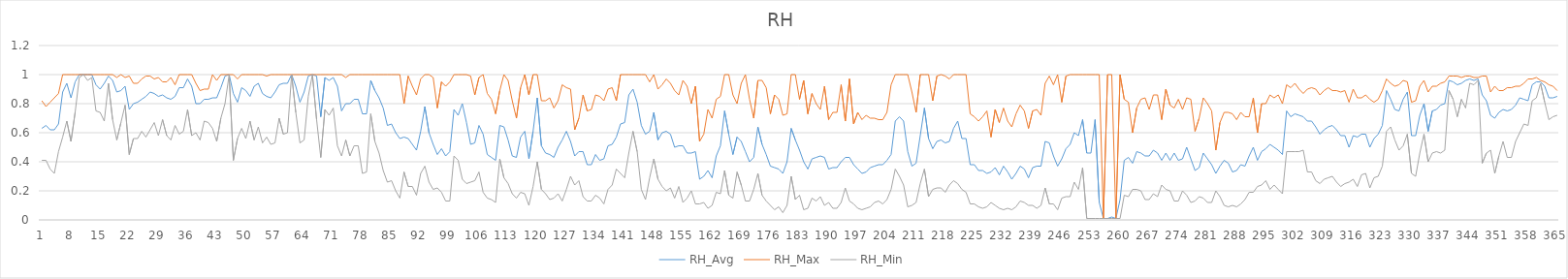
| Category | RH_Avg | RH_Max | RH_Min |
|---|---|---|---|
| 0 | 0.63 | 0.82 | 0.41 |
| 1 | 0.65 | 0.78 | 0.41 |
| 2 | 0.62 | 0.81 | 0.35 |
| 3 | 0.62 | 0.84 | 0.32 |
| 4 | 0.66 | 0.87 | 0.47 |
| 5 | 0.88 | 1 | 0.57 |
| 6 | 0.94 | 1 | 0.68 |
| 7 | 0.84 | 1 | 0.54 |
| 8 | 0.95 | 1 | 0.74 |
| 9 | 1 | 1 | 0.98 |
| 10 | 1 | 1 | 1 |
| 11 | 1 | 1 | 0.96 |
| 12 | 1 | 1 | 0.98 |
| 13 | 0.93 | 1 | 0.75 |
| 14 | 0.9 | 1 | 0.74 |
| 15 | 0.94 | 1 | 0.68 |
| 16 | 0.99 | 1 | 0.94 |
| 17 | 0.96 | 1 | 0.69 |
| 18 | 0.88 | 0.98 | 0.55 |
| 19 | 0.89 | 1 | 0.67 |
| 20 | 0.92 | 0.98 | 0.79 |
| 21 | 0.76 | 0.99 | 0.45 |
| 22 | 0.8 | 0.94 | 0.56 |
| 23 | 0.81 | 0.94 | 0.56 |
| 24 | 0.83 | 0.97 | 0.61 |
| 25 | 0.85 | 0.99 | 0.57 |
| 26 | 0.88 | 0.99 | 0.62 |
| 27 | 0.87 | 0.97 | 0.67 |
| 28 | 0.85 | 0.98 | 0.58 |
| 29 | 0.86 | 0.95 | 0.69 |
| 30 | 0.84 | 0.95 | 0.58 |
| 31 | 0.83 | 0.98 | 0.55 |
| 32 | 0.85 | 0.93 | 0.65 |
| 33 | 0.91 | 1 | 0.59 |
| 34 | 0.91 | 1 | 0.61 |
| 35 | 0.97 | 1 | 0.76 |
| 36 | 0.92 | 1 | 0.58 |
| 37 | 0.8 | 0.94 | 0.6 |
| 38 | 0.8 | 0.89 | 0.55 |
| 39 | 0.83 | 0.9 | 0.68 |
| 40 | 0.83 | 0.9 | 0.67 |
| 41 | 0.84 | 1 | 0.63 |
| 42 | 0.84 | 0.96 | 0.54 |
| 43 | 0.91 | 1 | 0.7 |
| 44 | 0.99 | 1 | 0.8 |
| 45 | 1 | 1 | 1 |
| 46 | 0.87 | 1 | 0.41 |
| 47 | 0.81 | 0.97 | 0.56 |
| 48 | 0.91 | 1 | 0.63 |
| 49 | 0.89 | 1 | 0.56 |
| 50 | 0.85 | 1 | 0.68 |
| 51 | 0.92 | 1 | 0.55 |
| 52 | 0.94 | 1 | 0.64 |
| 53 | 0.87 | 1 | 0.53 |
| 54 | 0.85 | 0.99 | 0.57 |
| 55 | 0.84 | 1 | 0.52 |
| 56 | 0.88 | 1 | 0.53 |
| 57 | 0.93 | 1 | 0.7 |
| 58 | 0.94 | 1 | 0.59 |
| 59 | 0.94 | 1 | 0.6 |
| 60 | 1 | 1 | 1 |
| 61 | 0.92 | 1 | 0.74 |
| 62 | 0.81 | 1 | 0.53 |
| 63 | 0.88 | 1 | 0.55 |
| 64 | 0.99 | 1 | 0.85 |
| 65 | 1 | 1 | 1 |
| 66 | 0.99 | 1 | 0.69 |
| 67 | 0.71 | 1 | 0.43 |
| 68 | 0.98 | 1 | 0.76 |
| 69 | 0.96 | 1 | 0.72 |
| 70 | 0.98 | 1 | 0.77 |
| 71 | 0.92 | 1 | 0.51 |
| 72 | 0.75 | 1 | 0.44 |
| 73 | 0.8 | 0.98 | 0.55 |
| 74 | 0.8 | 1 | 0.44 |
| 75 | 0.83 | 1 | 0.51 |
| 76 | 0.83 | 1 | 0.51 |
| 77 | 0.73 | 1 | 0.32 |
| 78 | 0.73 | 1 | 0.33 |
| 79 | 0.96 | 1 | 0.73 |
| 80 | 0.89 | 1 | 0.54 |
| 81 | 0.84 | 1 | 0.46 |
| 82 | 0.77 | 1 | 0.34 |
| 83 | 0.65 | 1 | 0.26 |
| 84 | 0.66 | 1 | 0.27 |
| 85 | 0.6 | 1 | 0.2 |
| 86 | 0.56 | 1 | 0.15 |
| 87 | 0.57 | 0.8 | 0.33 |
| 88 | 0.56 | 0.99 | 0.23 |
| 89 | 0.52 | 0.92 | 0.23 |
| 90 | 0.48 | 0.86 | 0.17 |
| 91 | 0.61 | 0.97 | 0.32 |
| 92 | 0.78 | 1 | 0.37 |
| 93 | 0.6 | 1 | 0.26 |
| 94 | 0.52 | 0.98 | 0.21 |
| 95 | 0.45 | 0.77 | 0.22 |
| 96 | 0.49 | 0.95 | 0.19 |
| 97 | 0.44 | 0.92 | 0.13 |
| 98 | 0.47 | 0.95 | 0.13 |
| 99 | 0.76 | 1 | 0.44 |
| 100 | 0.72 | 1 | 0.41 |
| 101 | 0.8 | 1 | 0.28 |
| 102 | 0.67 | 1 | 0.25 |
| 103 | 0.52 | 0.99 | 0.26 |
| 104 | 0.53 | 0.86 | 0.27 |
| 105 | 0.65 | 0.98 | 0.33 |
| 106 | 0.59 | 1 | 0.19 |
| 107 | 0.45 | 0.87 | 0.15 |
| 108 | 0.43 | 0.83 | 0.14 |
| 109 | 0.41 | 0.73 | 0.12 |
| 110 | 0.65 | 0.89 | 0.42 |
| 111 | 0.64 | 1 | 0.29 |
| 112 | 0.55 | 0.96 | 0.25 |
| 113 | 0.44 | 0.82 | 0.18 |
| 114 | 0.43 | 0.7 | 0.15 |
| 115 | 0.57 | 0.91 | 0.19 |
| 116 | 0.61 | 1 | 0.18 |
| 117 | 0.42 | 0.86 | 0.1 |
| 118 | 0.61 | 1 | 0.23 |
| 119 | 0.84 | 1 | 0.4 |
| 120 | 0.51 | 0.82 | 0.21 |
| 121 | 0.46 | 0.82 | 0.18 |
| 122 | 0.45 | 0.84 | 0.14 |
| 123 | 0.43 | 0.77 | 0.15 |
| 124 | 0.5 | 0.82 | 0.18 |
| 125 | 0.55 | 0.93 | 0.13 |
| 126 | 0.61 | 0.91 | 0.21 |
| 127 | 0.54 | 0.9 | 0.3 |
| 128 | 0.44 | 0.62 | 0.24 |
| 129 | 0.47 | 0.7 | 0.27 |
| 130 | 0.47 | 0.86 | 0.16 |
| 131 | 0.38 | 0.75 | 0.13 |
| 132 | 0.38 | 0.76 | 0.13 |
| 133 | 0.45 | 0.86 | 0.17 |
| 134 | 0.41 | 0.85 | 0.15 |
| 135 | 0.42 | 0.82 | 0.11 |
| 136 | 0.51 | 0.9 | 0.21 |
| 137 | 0.52 | 0.91 | 0.24 |
| 138 | 0.57 | 0.82 | 0.35 |
| 139 | 0.66 | 1 | 0.32 |
| 140 | 0.67 | 1 | 0.29 |
| 141 | 0.86 | 1 | 0.46 |
| 142 | 0.9 | 1 | 0.61 |
| 143 | 0.81 | 1 | 0.47 |
| 144 | 0.65 | 1 | 0.21 |
| 145 | 0.59 | 1 | 0.14 |
| 146 | 0.61 | 0.95 | 0.29 |
| 147 | 0.74 | 1 | 0.42 |
| 148 | 0.55 | 0.9 | 0.28 |
| 149 | 0.6 | 0.93 | 0.23 |
| 150 | 0.61 | 0.97 | 0.2 |
| 151 | 0.59 | 0.94 | 0.22 |
| 152 | 0.5 | 0.89 | 0.15 |
| 153 | 0.51 | 0.86 | 0.23 |
| 154 | 0.51 | 0.96 | 0.12 |
| 155 | 0.46 | 0.92 | 0.15 |
| 156 | 0.46 | 0.8 | 0.2 |
| 157 | 0.47 | 0.92 | 0.11 |
| 158 | 0.28 | 0.54 | 0.11 |
| 159 | 0.3 | 0.59 | 0.12 |
| 160 | 0.34 | 0.76 | 0.08 |
| 161 | 0.29 | 0.7 | 0.1 |
| 162 | 0.44 | 0.83 | 0.19 |
| 163 | 0.51 | 0.85 | 0.18 |
| 164 | 0.75 | 1 | 0.34 |
| 165 | 0.59 | 1 | 0.17 |
| 166 | 0.45 | 0.86 | 0.15 |
| 167 | 0.57 | 0.8 | 0.33 |
| 168 | 0.54 | 0.94 | 0.24 |
| 169 | 0.47 | 1 | 0.13 |
| 170 | 0.4 | 0.83 | 0.13 |
| 171 | 0.43 | 0.7 | 0.21 |
| 172 | 0.64 | 0.96 | 0.32 |
| 173 | 0.52 | 0.96 | 0.17 |
| 174 | 0.45 | 0.91 | 0.13 |
| 175 | 0.37 | 0.73 | 0.1 |
| 176 | 0.36 | 0.86 | 0.07 |
| 177 | 0.35 | 0.83 | 0.09 |
| 178 | 0.32 | 0.72 | 0.05 |
| 179 | 0.4 | 0.73 | 0.1 |
| 180 | 0.63 | 1 | 0.3 |
| 181 | 0.55 | 1 | 0.14 |
| 182 | 0.48 | 0.83 | 0.17 |
| 183 | 0.4 | 0.96 | 0.07 |
| 184 | 0.35 | 0.73 | 0.08 |
| 185 | 0.42 | 0.87 | 0.15 |
| 186 | 0.43 | 0.8 | 0.13 |
| 187 | 0.44 | 0.76 | 0.16 |
| 188 | 0.43 | 0.92 | 0.1 |
| 189 | 0.35 | 0.69 | 0.12 |
| 190 | 0.36 | 0.74 | 0.08 |
| 191 | 0.36 | 0.74 | 0.08 |
| 192 | 0.4 | 0.93 | 0.12 |
| 193 | 0.43 | 0.68 | 0.22 |
| 194 | 0.43 | 0.97 | 0.13 |
| 195 | 0.38 | 0.66 | 0.11 |
| 196 | 0.35 | 0.74 | 0.08 |
| 197 | 0.32 | 0.69 | 0.07 |
| 198 | 0.33 | 0.72 | 0.08 |
| 199 | 0.36 | 0.7 | 0.09 |
| 200 | 0.37 | 0.7 | 0.12 |
| 201 | 0.38 | 0.69 | 0.13 |
| 202 | 0.38 | 0.69 | 0.11 |
| 203 | 0.41 | 0.74 | 0.14 |
| 204 | 0.45 | 0.93 | 0.21 |
| 205 | 0.68 | 1 | 0.35 |
| 206 | 0.71 | 1 | 0.3 |
| 207 | 0.68 | 1 | 0.24 |
| 208 | 0.47 | 1 | 0.09 |
| 209 | 0.37 | 0.88 | 0.1 |
| 210 | 0.39 | 0.74 | 0.12 |
| 211 | 0.58 | 1 | 0.25 |
| 212 | 0.77 | 1 | 0.35 |
| 213 | 0.56 | 1 | 0.16 |
| 214 | 0.49 | 0.82 | 0.21 |
| 215 | 0.54 | 0.99 | 0.22 |
| 216 | 0.55 | 1 | 0.22 |
| 217 | 0.53 | 0.99 | 0.19 |
| 218 | 0.54 | 0.97 | 0.24 |
| 219 | 0.63 | 1 | 0.27 |
| 220 | 0.68 | 1 | 0.25 |
| 221 | 0.56 | 1 | 0.21 |
| 222 | 0.56 | 1 | 0.19 |
| 223 | 0.38 | 0.73 | 0.11 |
| 224 | 0.38 | 0.71 | 0.11 |
| 225 | 0.34 | 0.68 | 0.09 |
| 226 | 0.34 | 0.71 | 0.08 |
| 227 | 0.32 | 0.75 | 0.09 |
| 228 | 0.33 | 0.57 | 0.12 |
| 229 | 0.36 | 0.76 | 0.1 |
| 230 | 0.31 | 0.67 | 0.08 |
| 231 | 0.37 | 0.77 | 0.07 |
| 232 | 0.33 | 0.68 | 0.08 |
| 233 | 0.28 | 0.64 | 0.07 |
| 234 | 0.32 | 0.73 | 0.09 |
| 235 | 0.37 | 0.79 | 0.13 |
| 236 | 0.35 | 0.75 | 0.12 |
| 237 | 0.29 | 0.63 | 0.1 |
| 238 | 0.36 | 0.75 | 0.1 |
| 239 | 0.37 | 0.76 | 0.08 |
| 240 | 0.37 | 0.72 | 0.1 |
| 241 | 0.54 | 0.94 | 0.22 |
| 242 | 0.53 | 0.99 | 0.11 |
| 243 | 0.44 | 0.93 | 0.11 |
| 244 | 0.37 | 1 | 0.07 |
| 245 | 0.42 | 0.81 | 0.15 |
| 246 | 0.49 | 0.99 | 0.16 |
| 247 | 0.52 | 1 | 0.16 |
| 248 | 0.6 | 1 | 0.26 |
| 249 | 0.58 | 1 | 0.21 |
| 250 | 0.69 | 1 | 0.36 |
| 251 | 0.46 | 1 | 0.01 |
| 252 | 0.46 | 1 | 0.01 |
| 253 | 0.69 | 1 | 0.01 |
| 254 | 0.12 | 1 | 0.01 |
| 255 | 0.01 | 0.01 | 0.01 |
| 256 | 0.01 | 1 | 0.01 |
| 257 | 0.02 | 1 | 0.01 |
| 258 | 0.01 | 0.01 | 0.01 |
| 259 | 0.14 | 1 | 0.01 |
| 260 | 0.41 | 0.83 | 0.17 |
| 261 | 0.43 | 0.81 | 0.16 |
| 262 | 0.39 | 0.6 | 0.21 |
| 263 | 0.47 | 0.77 | 0.21 |
| 264 | 0.46 | 0.83 | 0.2 |
| 265 | 0.44 | 0.84 | 0.14 |
| 266 | 0.44 | 0.76 | 0.14 |
| 267 | 0.48 | 0.86 | 0.18 |
| 268 | 0.46 | 0.86 | 0.16 |
| 269 | 0.41 | 0.69 | 0.24 |
| 270 | 0.46 | 0.9 | 0.21 |
| 271 | 0.41 | 0.79 | 0.2 |
| 272 | 0.46 | 0.77 | 0.13 |
| 273 | 0.41 | 0.83 | 0.13 |
| 274 | 0.42 | 0.76 | 0.2 |
| 275 | 0.5 | 0.84 | 0.17 |
| 276 | 0.42 | 0.83 | 0.12 |
| 277 | 0.34 | 0.61 | 0.13 |
| 278 | 0.36 | 0.7 | 0.16 |
| 279 | 0.46 | 0.84 | 0.15 |
| 280 | 0.42 | 0.8 | 0.12 |
| 281 | 0.38 | 0.75 | 0.12 |
| 282 | 0.32 | 0.48 | 0.2 |
| 283 | 0.37 | 0.67 | 0.16 |
| 284 | 0.41 | 0.74 | 0.1 |
| 285 | 0.39 | 0.74 | 0.09 |
| 286 | 0.33 | 0.73 | 0.1 |
| 287 | 0.34 | 0.69 | 0.09 |
| 288 | 0.38 | 0.74 | 0.11 |
| 289 | 0.37 | 0.71 | 0.14 |
| 290 | 0.44 | 0.71 | 0.19 |
| 291 | 0.5 | 0.84 | 0.19 |
| 292 | 0.41 | 0.6 | 0.23 |
| 293 | 0.47 | 0.8 | 0.24 |
| 294 | 0.49 | 0.8 | 0.27 |
| 295 | 0.52 | 0.86 | 0.21 |
| 296 | 0.5 | 0.84 | 0.24 |
| 297 | 0.48 | 0.86 | 0.21 |
| 298 | 0.45 | 0.8 | 0.18 |
| 299 | 0.75 | 0.93 | 0.47 |
| 300 | 0.71 | 0.91 | 0.47 |
| 301 | 0.73 | 0.94 | 0.47 |
| 302 | 0.72 | 0.9 | 0.47 |
| 303 | 0.71 | 0.87 | 0.48 |
| 304 | 0.68 | 0.9 | 0.33 |
| 305 | 0.68 | 0.91 | 0.33 |
| 306 | 0.64 | 0.9 | 0.27 |
| 307 | 0.59 | 0.86 | 0.25 |
| 308 | 0.62 | 0.89 | 0.28 |
| 309 | 0.64 | 0.91 | 0.29 |
| 310 | 0.65 | 0.89 | 0.3 |
| 311 | 0.62 | 0.89 | 0.26 |
| 312 | 0.58 | 0.88 | 0.23 |
| 313 | 0.58 | 0.89 | 0.25 |
| 314 | 0.5 | 0.81 | 0.26 |
| 315 | 0.58 | 0.9 | 0.28 |
| 316 | 0.57 | 0.84 | 0.23 |
| 317 | 0.59 | 0.84 | 0.31 |
| 318 | 0.59 | 0.86 | 0.32 |
| 319 | 0.5 | 0.83 | 0.22 |
| 320 | 0.56 | 0.81 | 0.29 |
| 321 | 0.59 | 0.83 | 0.3 |
| 322 | 0.65 | 0.89 | 0.37 |
| 323 | 0.89 | 0.97 | 0.61 |
| 324 | 0.83 | 0.94 | 0.64 |
| 325 | 0.76 | 0.92 | 0.55 |
| 326 | 0.75 | 0.93 | 0.48 |
| 327 | 0.83 | 0.96 | 0.51 |
| 328 | 0.88 | 0.95 | 0.59 |
| 329 | 0.58 | 0.81 | 0.32 |
| 330 | 0.58 | 0.82 | 0.3 |
| 331 | 0.72 | 0.92 | 0.46 |
| 332 | 0.8 | 0.96 | 0.59 |
| 333 | 0.61 | 0.88 | 0.4 |
| 334 | 0.75 | 0.92 | 0.46 |
| 335 | 0.76 | 0.92 | 0.47 |
| 336 | 0.79 | 0.94 | 0.46 |
| 337 | 0.8 | 0.95 | 0.48 |
| 338 | 0.96 | 0.99 | 0.89 |
| 339 | 0.95 | 0.99 | 0.83 |
| 340 | 0.93 | 0.99 | 0.71 |
| 341 | 0.94 | 0.98 | 0.83 |
| 342 | 0.96 | 0.99 | 0.77 |
| 343 | 0.97 | 0.99 | 0.94 |
| 344 | 0.96 | 0.98 | 0.93 |
| 345 | 0.97 | 0.98 | 0.96 |
| 346 | 0.86 | 0.99 | 0.39 |
| 347 | 0.82 | 0.99 | 0.46 |
| 348 | 0.72 | 0.88 | 0.48 |
| 349 | 0.7 | 0.92 | 0.32 |
| 350 | 0.74 | 0.89 | 0.44 |
| 351 | 0.76 | 0.89 | 0.54 |
| 352 | 0.75 | 0.91 | 0.43 |
| 353 | 0.76 | 0.91 | 0.43 |
| 354 | 0.79 | 0.92 | 0.54 |
| 355 | 0.84 | 0.92 | 0.6 |
| 356 | 0.83 | 0.94 | 0.66 |
| 357 | 0.82 | 0.97 | 0.65 |
| 358 | 0.93 | 0.97 | 0.82 |
| 359 | 0.95 | 0.98 | 0.84 |
| 360 | 0.95 | 0.96 | 0.94 |
| 361 | 0.92 | 0.95 | 0.81 |
| 362 | 0.84 | 0.93 | 0.69 |
| 363 | 0.84 | 0.92 | 0.71 |
| 364 | 0.85 | 0.89 | 0.72 |